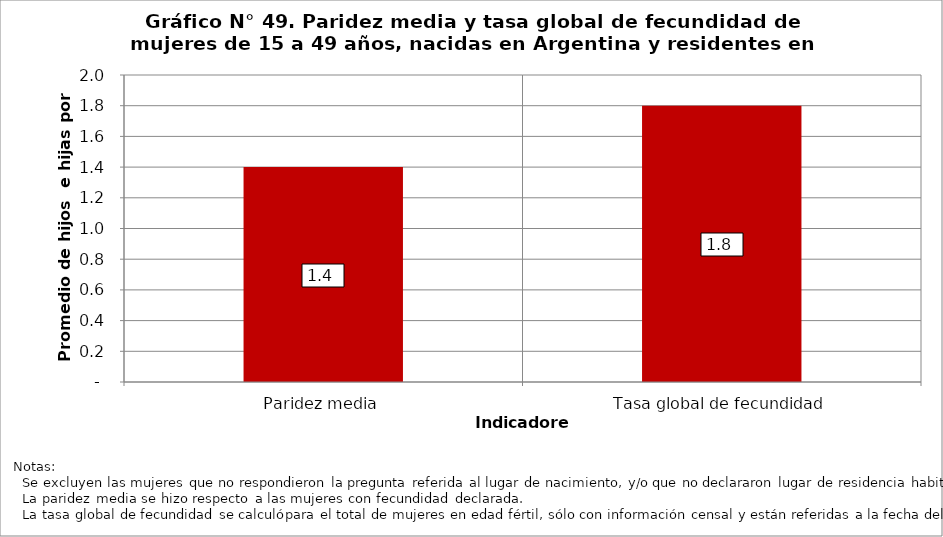
| Category | Argentina |
|---|---|
| Paridez media | 1.4 |
| Tasa global de fecundidad | 1.8 |